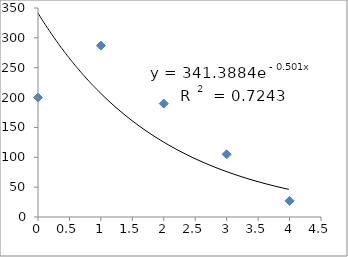
| Category | Series 0 |
|---|---|
| 0.0 | 200 |
| 1.0 | 287 |
| 2.0 | 190 |
| 3.0 | 105 |
| 4.0 | 27 |